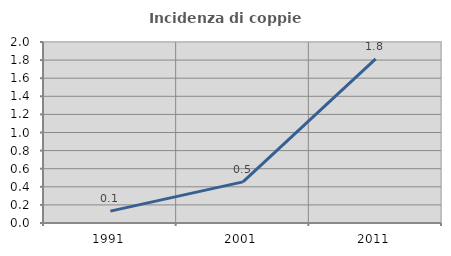
| Category | Incidenza di coppie miste |
|---|---|
| 1991.0 | 0.131 |
| 2001.0 | 0.455 |
| 2011.0 | 1.814 |